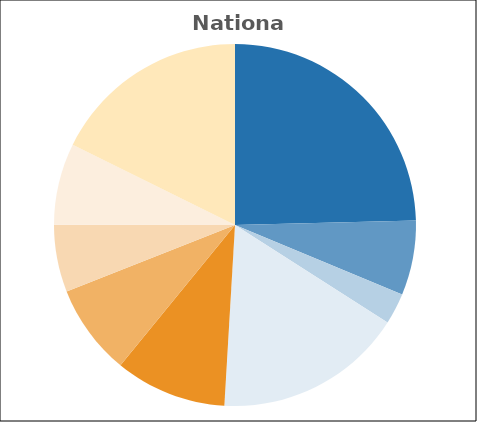
| Category | Series 0 |
|---|---|
| Basic Assistance | 0.246 |
| Work Activities | 0.067 |
| Work Supports and Supportive Services | 0.028 |
| Child Care | 0.169 |
| Administration & Systems | 0.1 |
| Tax Credit | 0.081 |
| Pre-K | 0.06 |
| Child Welfare | 0.073 |
| Other | 0.177 |